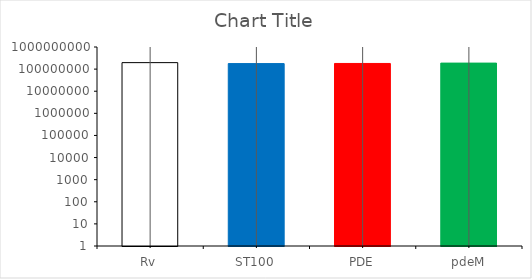
| Category | Series 0 |
|---|---|
| Rv | 196444444.444 |
| ST100 | 177777777.778 |
| PDE | 180000000 |
| pdeM | 187111111.111 |